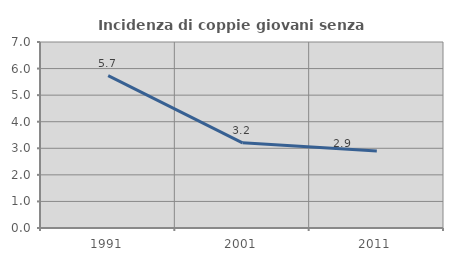
| Category | Incidenza di coppie giovani senza figli |
|---|---|
| 1991.0 | 5.735 |
| 2001.0 | 3.205 |
| 2011.0 | 2.902 |